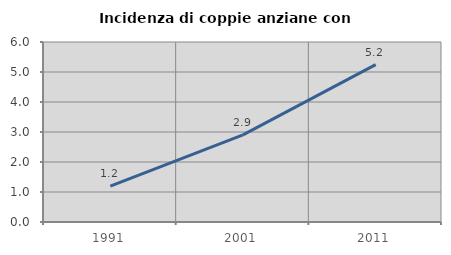
| Category | Incidenza di coppie anziane con figli |
|---|---|
| 1991.0 | 1.195 |
| 2001.0 | 2.906 |
| 2011.0 | 5.245 |